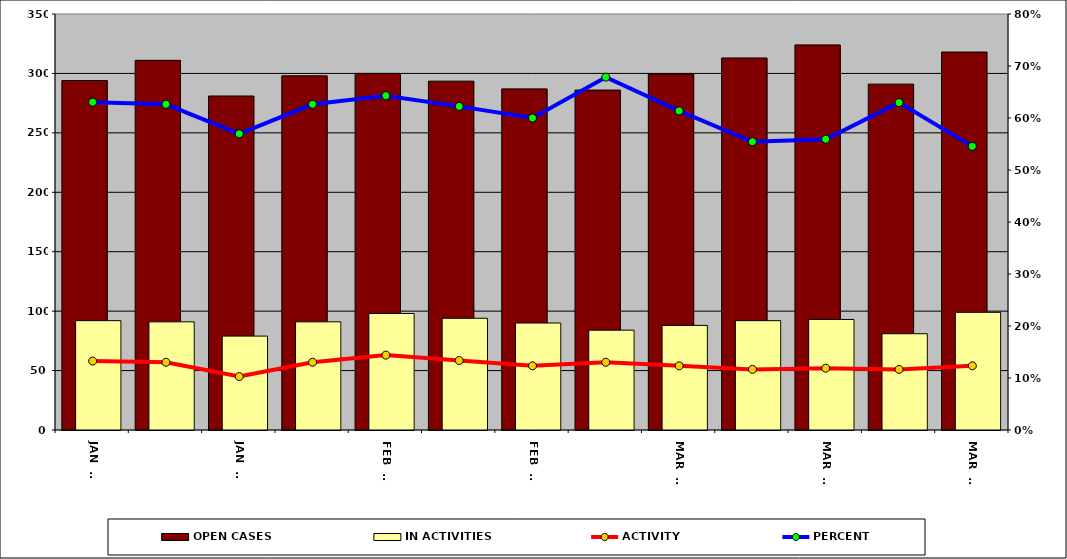
| Category | OPEN CASES | IN ACTIVITIES |
|---|---|---|
| NOV 21 | 294 | 92 |
| NOV 28 | 311 | 91 |
| DEC 05 | 281 | 79 |
| DEC 12 | 298 | 91 |
| DEC 19 | 300 | 98 |
| DEC 26 | 293.5 | 94 |
| JAN 02 | 287 | 90 |
| JAN 09 | 286 | 84 |
| JAN 16 | 299.5 | 88 |
| JAN 23 | 313 | 92 |
| JAN 30 | 324 | 93 |
| FEB 06 | 291 | 81 |
| FEB 13 | 318 | 99 |